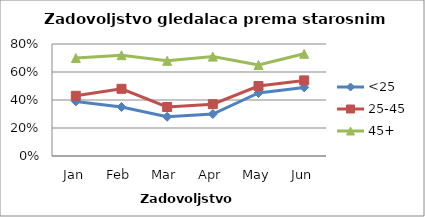
| Category | <25 | 25-45 | 45+ |
|---|---|---|---|
| Jan | 0.39 | 0.43 | 0.7 |
| Feb | 0.35 | 0.48 | 0.72 |
| Mar | 0.28 | 0.35 | 0.68 |
| Apr | 0.3 | 0.37 | 0.71 |
| May | 0.45 | 0.5 | 0.65 |
| Jun | 0.49 | 0.54 | 0.73 |